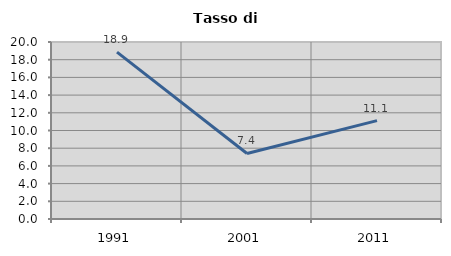
| Category | Tasso di disoccupazione   |
|---|---|
| 1991.0 | 18.852 |
| 2001.0 | 7.407 |
| 2011.0 | 11.111 |